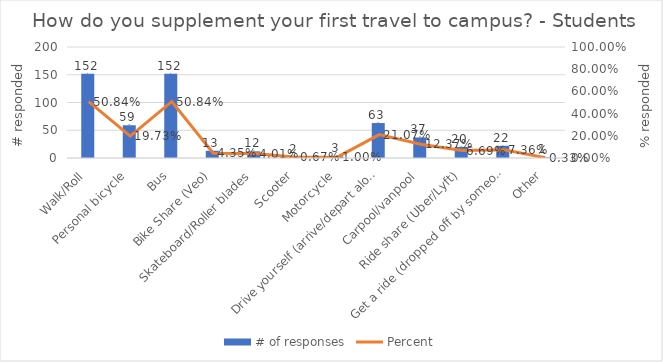
| Category | # of responses |
|---|---|
| Walk/Roll | 152 |
| Personal bicycle | 59 |
| Bus | 152 |
| Bike Share (Veo) | 13 |
| Skateboard/Roller blades | 12 |
| Scooter | 2 |
| Motorcycle | 3 |
| Drive yourself (arrive/depart alone) | 63 |
| Carpool/vanpool | 37 |
| Ride share (Uber/Lyft) | 20 |
| Get a ride (dropped off by someone who goes elsewhere... not in campus | 22 |
| Other | 1 |